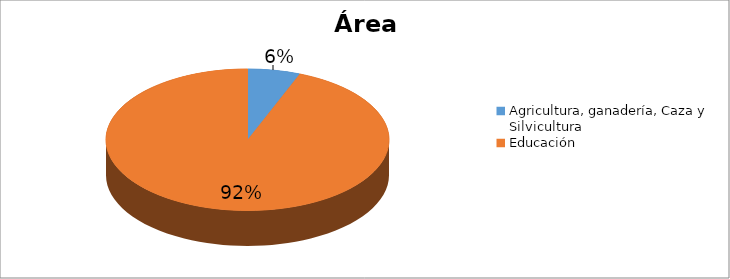
| Category | Series 0 |
|---|---|
| Agricultura, ganadería, Caza y Silvicultura | 0.059 |
| Educación | 0.922 |